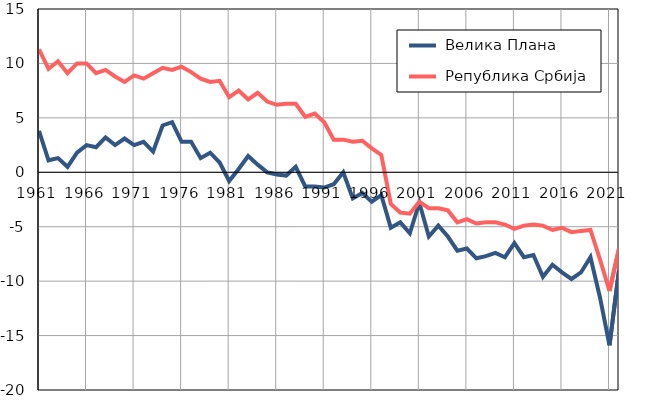
| Category |  Велика Плана |  Република Србија |
|---|---|---|
| 1961.0 | 3.8 | 11.3 |
| 1962.0 | 1.1 | 9.5 |
| 1963.0 | 1.3 | 10.2 |
| 1964.0 | 0.5 | 9.1 |
| 1965.0 | 1.8 | 10 |
| 1966.0 | 2.5 | 10 |
| 1967.0 | 2.3 | 9.1 |
| 1968.0 | 3.2 | 9.4 |
| 1969.0 | 2.5 | 8.8 |
| 1970.0 | 3.1 | 8.3 |
| 1971.0 | 2.5 | 8.9 |
| 1972.0 | 2.8 | 8.6 |
| 1973.0 | 1.9 | 9.1 |
| 1974.0 | 4.3 | 9.6 |
| 1975.0 | 4.6 | 9.4 |
| 1976.0 | 2.8 | 9.7 |
| 1977.0 | 2.8 | 9.2 |
| 1978.0 | 1.3 | 8.6 |
| 1979.0 | 1.8 | 8.3 |
| 1980.0 | 0.9 | 8.4 |
| 1981.0 | -0.8 | 6.9 |
| 1982.0 | 0.3 | 7.5 |
| 1983.0 | 1.5 | 6.7 |
| 1984.0 | 0.7 | 7.3 |
| 1985.0 | 0 | 6.5 |
| 1986.0 | -0.2 | 6.2 |
| 1987.0 | -0.3 | 6.3 |
| 1988.0 | 0.5 | 6.3 |
| 1989.0 | -1.3 | 5.1 |
| 1990.0 | -1.3 | 5.4 |
| 1991.0 | -1.4 | 4.6 |
| 1992.0 | -1.1 | 3 |
| 1993.0 | 0 | 3 |
| 1994.0 | -2.4 | 2.8 |
| 1995.0 | -1.9 | 2.9 |
| 1996.0 | -2.7 | 2.2 |
| 1997.0 | -2.1 | 1.6 |
| 1998.0 | -5.1 | -2.9 |
| 1999.0 | -4.6 | -3.7 |
| 2000.0 | -5.6 | -3.8 |
| 2001.0 | -2.8 | -2.7 |
| 2002.0 | -5.9 | -3.3 |
| 2003.0 | -4.9 | -3.3 |
| 2004.0 | -5.9 | -3.5 |
| 2005.0 | -7.2 | -4.6 |
| 2006.0 | -7 | -4.3 |
| 2007.0 | -7.9 | -4.7 |
| 2008.0 | -7.7 | -4.6 |
| 2009.0 | -7.4 | -4.6 |
| 2010.0 | -7.8 | -4.8 |
| 2011.0 | -6.5 | -5.2 |
| 2012.0 | -7.8 | -4.9 |
| 2013.0 | -7.6 | -4.8 |
| 2014.0 | -9.6 | -4.9 |
| 2015.0 | -8.5 | -5.3 |
| 2016.0 | -9.2 | -5.1 |
| 2017.0 | -9.8 | -5.5 |
| 2018.0 | -9.2 | -5.4 |
| 2019.0 | -7.8 | -5.3 |
| 2020.0 | -11.5 | -8 |
| 2021.0 | -15.9 | -10.9 |
| 2022.0 | -9 | -7 |